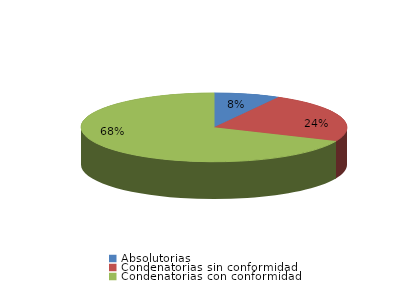
| Category | Series 0 |
|---|---|
| Absolutorias | 18 |
| Condenatorias sin conformidad | 53 |
| Condenatorias con conformidad | 154 |